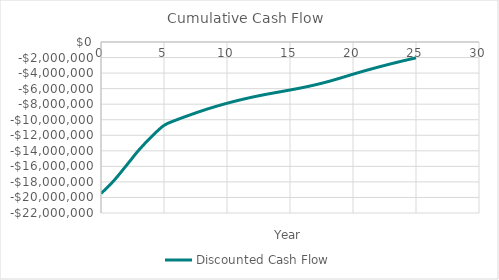
| Category | Discounted Cash Flow |
|---|---|
| 0.0 | -19500000 |
| 1.0 | -17874505.889 |
| 2.0 | -15918058.872 |
| 3.0 | -13909620.699 |
| 4.0 | -12207352.792 |
| 5.0 | -10729709.568 |
| 6.0 | -10018770.897 |
| 7.0 | -9421299.119 |
| 8.0 | -8856230.95 |
| 9.0 | -8344776.988 |
| 10.0 | -7883207.779 |
| 11.0 | -7468025.955 |
| 12.0 | -7095952.607 |
| 13.0 | -6763914.419 |
| 14.0 | -6469031.545 |
| 15.0 | -6174576.808 |
| 16.0 | -5865079.443 |
| 17.0 | -5511896.044 |
| 18.0 | -5105320.333 |
| 19.0 | -4637375.858 |
| 20.0 | -4141585.606 |
| 21.0 | -3672486.013 |
| 22.0 | -3228743.199 |
| 23.0 | -2809088.191 |
| 24.0 | -2412313.801 |
| 25.0 | -2037271.647 |